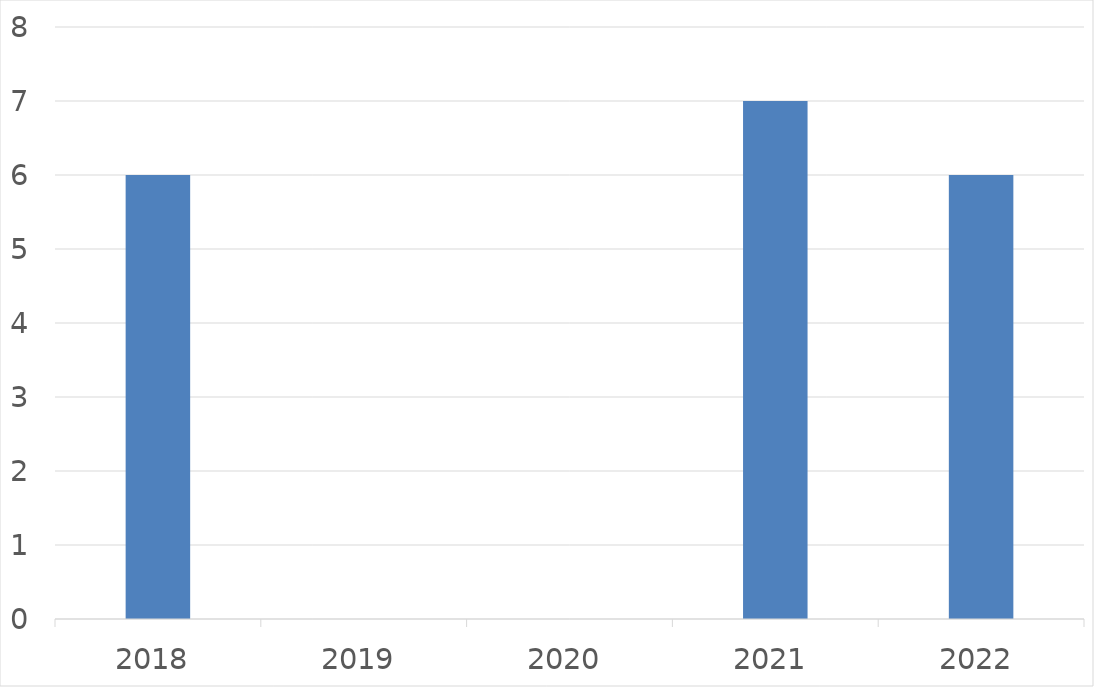
| Category | Series 0 |
|---|---|
| 2018 | 6 |
| 2019 | 0 |
| 2020 | 0 |
| 2021 | 7 |
| 2022 | 6 |